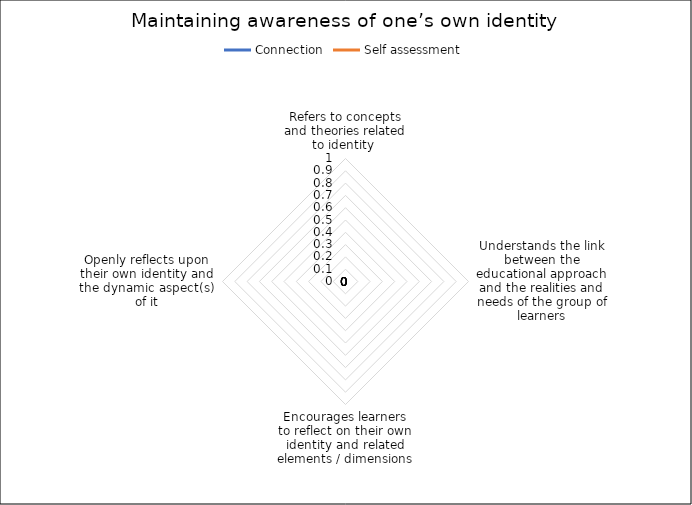
| Category | Connection | Self assessment |
|---|---|---|
| Refers to concepts and theories related to identity  | 0 | 0 |
| Understands the link between the educational approach and the realities and needs of the group of learners | 0 | 0 |
| Encourages learners to reflect on their own identity and related elements / dimensions | 0 | 0 |
| Openly reflects upon their own identity and the dynamic aspect(s) of it | 0 | 0 |